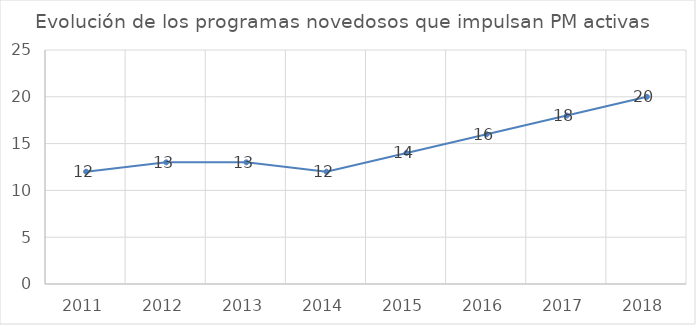
| Category | Programas novedosos |
|---|---|
| 2011.0 | 12 |
| 2012.0 | 13 |
| 2013.0 | 13 |
| 2014.0 | 12 |
| 2015.0 | 14 |
| 2016.0 | 16 |
| 2017.0 | 18 |
| 2018.0 | 20 |